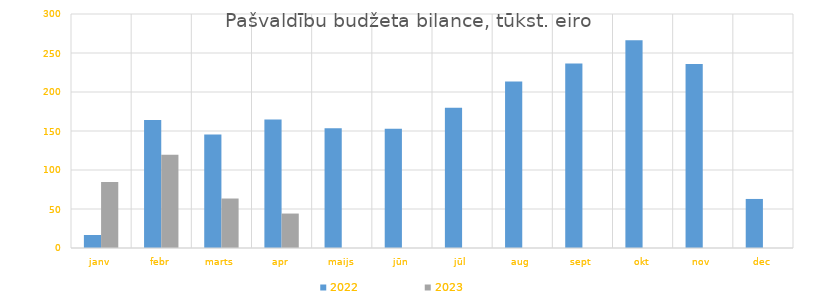
| Category | 2022 | 2023 |
|---|---|---|
| janv | 16703.923 | 84479.098 |
| febr | 164205.671 | 119462.892 |
| marts | 145513.563 | 63449.124 |
| apr | 164636.583 | 44164.06 |
| maijs | 153483.094 | 0 |
| jūn | 152800.466 | 0 |
| jūl | 179788.756 | 0 |
| aug | 213558.674 | 0 |
| sept | 236659.668 | 0 |
| okt | 266405.755 | 0 |
| nov | 235826.103 | 0 |
| dec | 62884.159 | 0 |